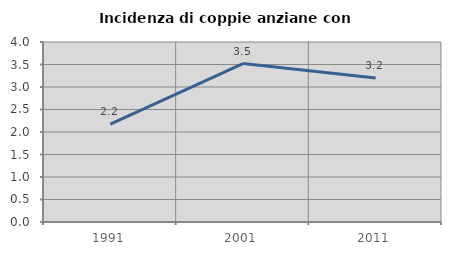
| Category | Incidenza di coppie anziane con figli |
|---|---|
| 1991.0 | 2.174 |
| 2001.0 | 3.521 |
| 2011.0 | 3.2 |